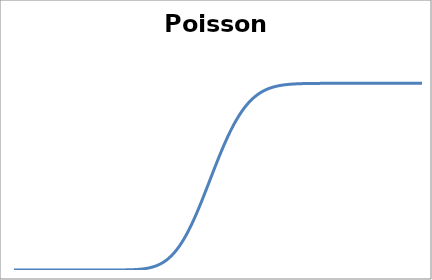
| Category | PoissonC |
|---|---|
| 1.0 | 0 |
| 2.0 | 0 |
| 3.0 | 0 |
| 4.0 | 0 |
| 5.0 | 0 |
| 6.0 | 0 |
| 7.0 | 0 |
| 8.0 | 0 |
| 9.0 | 0 |
| 10.0 | 0 |
| 11.0 | 0 |
| 12.0 | 0 |
| 13.0 | 0 |
| 14.0 | 0 |
| 15.0 | 0 |
| 16.0 | 0 |
| 17.0 | 0 |
| 18.0 | 0 |
| 19.0 | 0 |
| 20.0 | 0 |
| 21.0 | 0 |
| 22.0 | 0 |
| 23.0 | 0 |
| 24.0 | 0 |
| 25.0 | 0 |
| 26.0 | 0 |
| 27.0 | 0 |
| 28.0 | 0.001 |
| 29.0 | 0.001 |
| 30.0 | 0.002 |
| 31.0 | 0.003 |
| 32.0 | 0.004 |
| 33.0 | 0.007 |
| 34.0 | 0.011 |
| 35.0 | 0.016 |
| 36.0 | 0.024 |
| 37.0 | 0.034 |
| 38.0 | 0.047 |
| 39.0 | 0.065 |
| 40.0 | 0.086 |
| 41.0 | 0.112 |
| 42.0 | 0.144 |
| 43.0 | 0.18 |
| 44.0 | 0.221 |
| 45.0 | 0.267 |
| 46.0 | 0.317 |
| 47.0 | 0.37 |
| 48.0 | 0.425 |
| 49.0 | 0.481 |
| 50.0 | 0.538 |
| 51.0 | 0.593 |
| 52.0 | 0.646 |
| 53.0 | 0.696 |
| 54.0 | 0.742 |
| 55.0 | 0.784 |
| 56.0 | 0.822 |
| 57.0 | 0.855 |
| 58.0 | 0.884 |
| 59.0 | 0.908 |
| 60.0 | 0.928 |
| 61.0 | 0.944 |
| 62.0 | 0.958 |
| 63.0 | 0.968 |
| 64.0 | 0.976 |
| 65.0 | 0.983 |
| 66.0 | 0.988 |
| 67.0 | 0.991 |
| 68.0 | 0.994 |
| 69.0 | 0.996 |
| 70.0 | 0.997 |
| 71.0 | 0.998 |
| 72.0 | 0.999 |
| 73.0 | 0.999 |
| 74.0 | 0.999 |
| 75.0 | 1 |
| 76.0 | 1 |
| 77.0 | 1 |
| 78.0 | 1 |
| 79.0 | 1 |
| 80.0 | 1 |
| 81.0 | 1 |
| 82.0 | 1 |
| 83.0 | 1 |
| 84.0 | 1 |
| 85.0 | 1 |
| 86.0 | 1 |
| 87.0 | 1 |
| 88.0 | 1 |
| 89.0 | 1 |
| 90.0 | 1 |
| 91.0 | 1 |
| 92.0 | 1 |
| 93.0 | 1 |
| 94.0 | 1 |
| 95.0 | 1 |
| 96.0 | 1 |
| 97.0 | 1 |
| 98.0 | 1 |
| 99.0 | 1 |
| 100.0 | 1 |
| 101.0 | 1 |